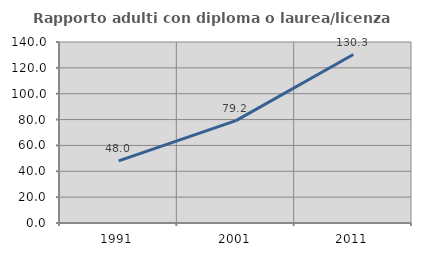
| Category | Rapporto adulti con diploma o laurea/licenza media  |
|---|---|
| 1991.0 | 48 |
| 2001.0 | 79.208 |
| 2011.0 | 130.317 |